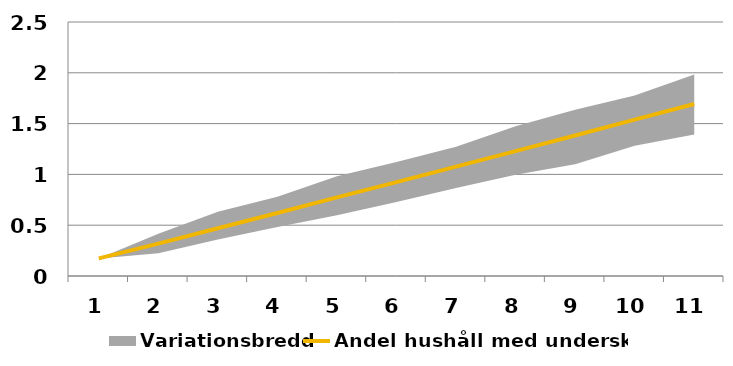
| Category | Andel hushåll med underskott |
|---|---|
| 0 | 0.173 |
| 1 | 0.319 |
| 2 | 0.47 |
| 3 | 0.62 |
| 4 | 0.774 |
| 5 | 0.924 |
| 6 | 1.076 |
| 7 | 1.229 |
| 8 | 1.383 |
| 9 | 1.539 |
| 10 | 1.692 |